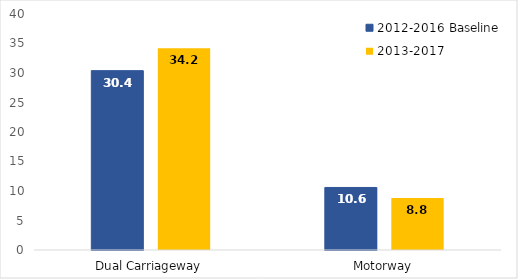
| Category | 2012-2016 Baseline | 2013-2017 |
|---|---|---|
| Dual Carriageway | 30.4 | 34.2 |
| Motorway | 10.6 | 8.8 |